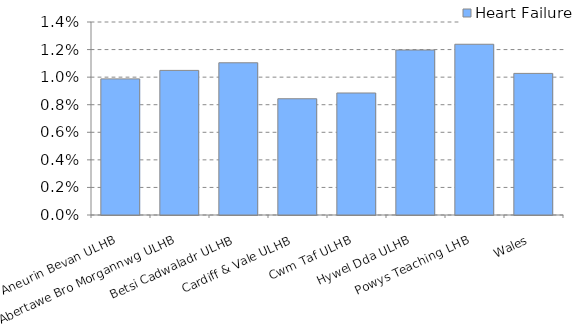
| Category | Heart Failure  |
|---|---|
| Aneurin Bevan ULHB | 0.01 |
| Abertawe Bro Morgannwg ULHB | 0.01 |
| Betsi Cadwaladr ULHB | 0.011 |
| Cardiff & Vale ULHB | 0.008 |
| Cwm Taf ULHB | 0.009 |
| Hywel Dda ULHB | 0.012 |
| Powys Teaching LHB | 0.012 |
| Wales | 0.01 |